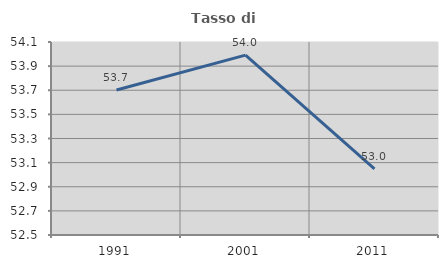
| Category | Tasso di occupazione   |
|---|---|
| 1991.0 | 53.702 |
| 2001.0 | 53.991 |
| 2011.0 | 53.049 |